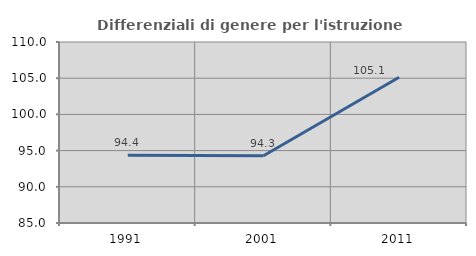
| Category | Differenziali di genere per l'istruzione superiore |
|---|---|
| 1991.0 | 94.362 |
| 2001.0 | 94.288 |
| 2011.0 | 105.137 |